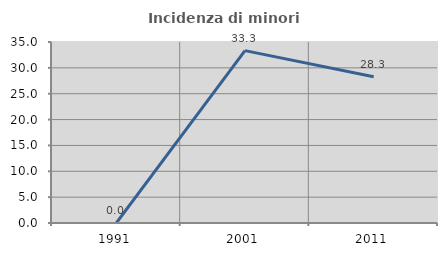
| Category | Incidenza di minori stranieri |
|---|---|
| 1991.0 | 0 |
| 2001.0 | 33.333 |
| 2011.0 | 28.289 |